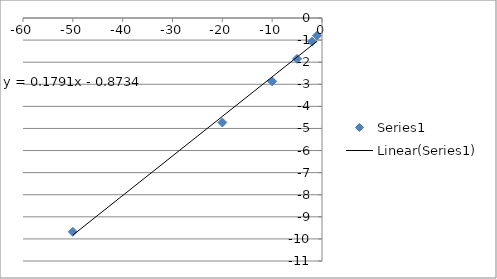
| Category | Series 0 |
|---|---|
| -1.0 | -0.8 |
| -2.0 | -1.07 |
| -5.0 | -1.85 |
| -10.0 | -2.87 |
| -20.0 | -4.73 |
| -50.0 | -9.68 |